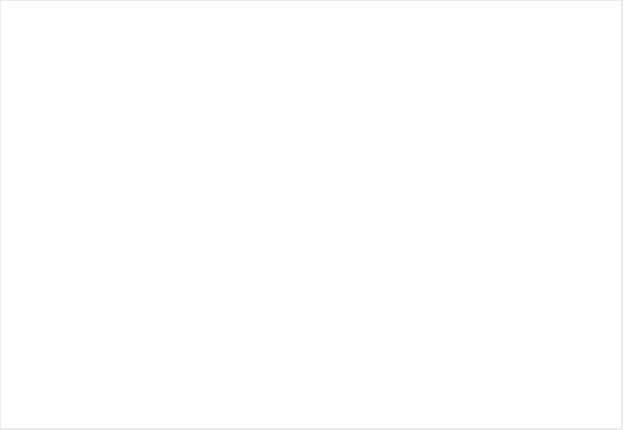
| Category | Bestuur | Civiel | Straf |
|---|---|---|---|
| 2011 | 112487 | 179544 | 106287 |
| 2012 | 115925 | 197985 | 116646 |
| 2013 | 112173 | 199187 | 121187 |
| 2014 | 114728 | 182369 | 123659 |
| 2015 | 110069 | 174977 | 124897 |
| 2016 | 120444 | 177434 | 121550 |
| 2017 | 100655 | 169800 | 119324 |
| 2018 | 101122 | 166376 | 114078 |
| 2019 | 100482 | 162474 | 113677 |
| 2020 | 86853 | 160878 | 104569 |
| 2021 | 80419 | 141420 | 106187 |
| 2022 | 87376 | 146501 | 114077 |